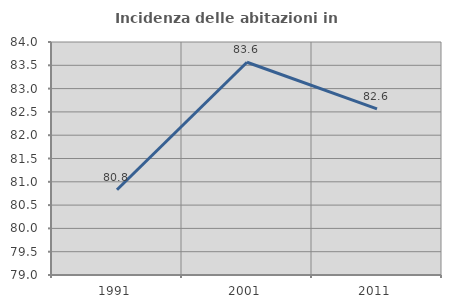
| Category | Incidenza delle abitazioni in proprietà  |
|---|---|
| 1991.0 | 80.829 |
| 2001.0 | 83.565 |
| 2011.0 | 82.563 |